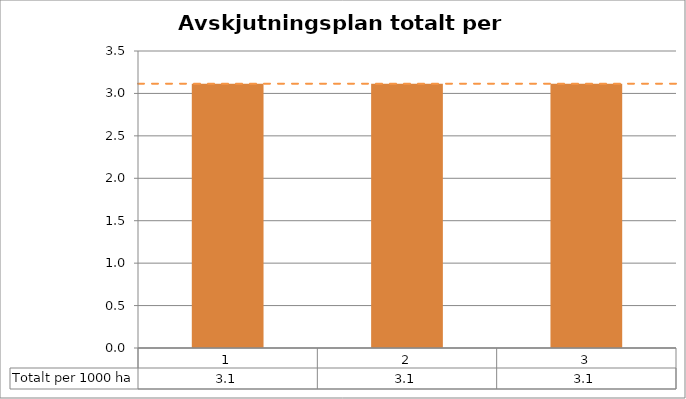
| Category | Totalt per 1000 ha |
|---|---|
| 0 | 3.114 |
| 1 | 3.114 |
| 2 | 3.114 |